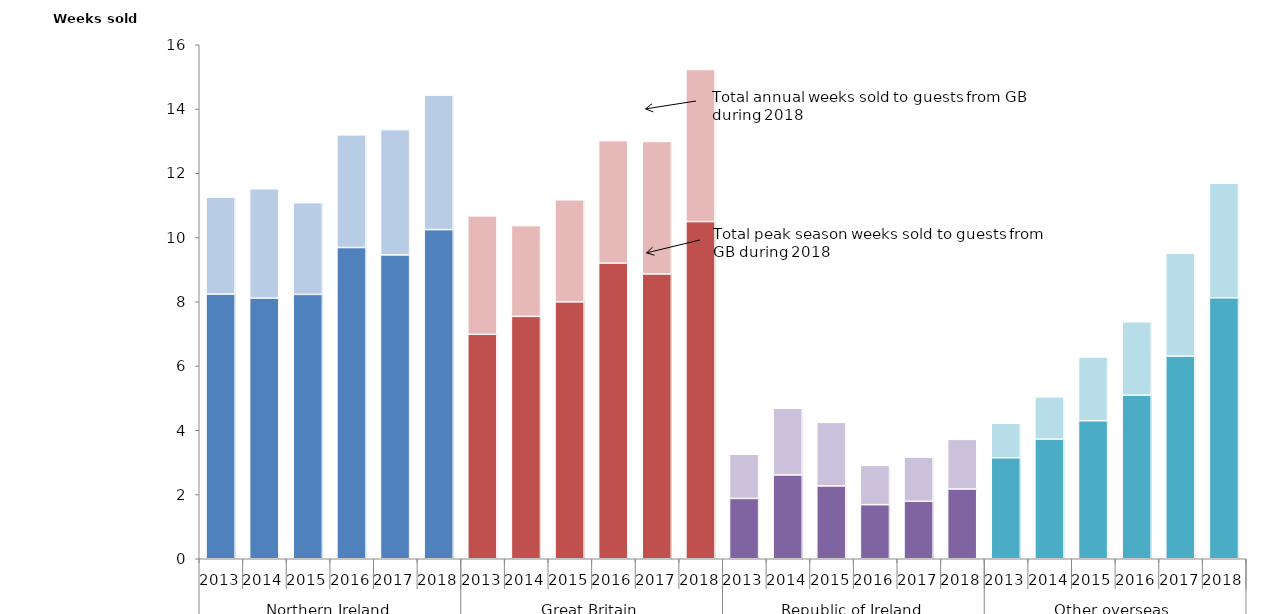
| Category | Peak  | Off-peak |
|---|---|---|
| 0 | 8238.994 | 3015.501 |
| 1 | 8111.252 | 3405.425 |
| 2 | 8229.447 | 2854.723 |
| 3 | 9688.424 | 3506.21 |
| 4 | 9457.999 | 3900.299 |
| 5 | 10245.611 | 4186.78 |
| 6 | 6986.403 | 3687.95 |
| 7 | 7544.945 | 2825.045 |
| 8 | 7997.311 | 3177.601 |
| 9 | 9199.316 | 3815.533 |
| 10 | 8866.686 | 4123.577 |
| 11 | 10495.636 | 4734.041 |
| 12 | 1877.399 | 1375.856 |
| 13 | 2609.96 | 2073.728 |
| 14 | 2268.114 | 1976.836 |
| 15 | 1683.443 | 1222.477 |
| 16 | 1789.394 | 1375.619 |
| 17 | 2172.004 | 1544.784 |
| 18 | 3144.838 | 1072.332 |
| 19 | 3723.025 | 1316.715 |
| 20 | 4297.316 | 1983.451 |
| 21 | 5091.187 | 2286.98 |
| 22 | 6306.897 | 3203.039 |
| 23 | 8124.394 | 3565.526 |